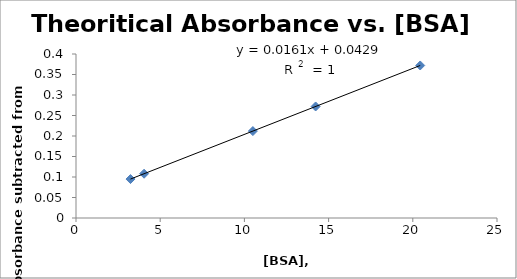
| Category | Series 0 |
|---|---|
| 3.2360248447204953 | 0.095 |
| 4.0434782608695645 | 0.108 |
| 10.503105590062118 | 0.212 |
| 14.229813664596275 | 0.272 |
| 20.440993788819878 | 0.372 |